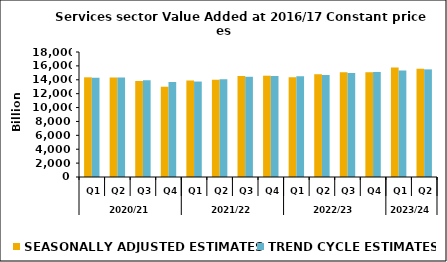
| Category | SEASONALLY ADJUSTED ESTIMATES | TREND CYCLE ESTIMATES |
|---|---|---|
| 0 | 14354.098 | 14276.716 |
| 1 | 14332.725 | 14335.966 |
| 2 | 13823.185 | 13935.285 |
| 3 | 13002.535 | 13673.961 |
| 4 | 13900.206 | 13744.259 |
| 5 | 14017.75 | 14062.644 |
| 6 | 14534.897 | 14431.86 |
| 7 | 14587.333 | 14538.519 |
| 8 | 14361.662 | 14491.506 |
| 9 | 14798.179 | 14682.915 |
| 10 | 15092.816 | 14976.014 |
| 11 | 15084.648 | 15127.58 |
| 12 | 15780.502 | 15327.933 |
| 13 | 15605.96 | 15496.766 |